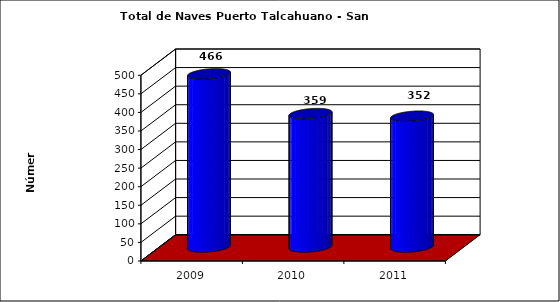
| Category | Series 0 |
|---|---|
| 2009.0 | 466 |
| 2010.0 | 359 |
| 2011.0 | 352 |